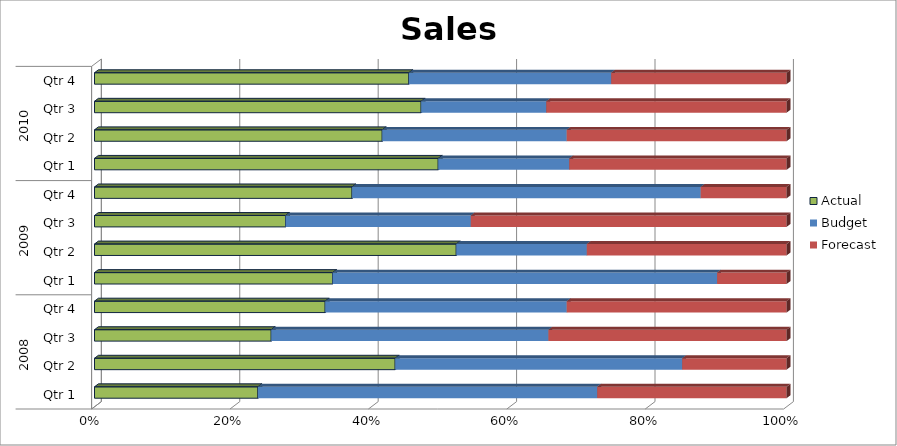
| Category | Actual | Budget | Forecast |
|---|---|---|---|
| 0 | 1450 | 3010 | 1680 |
| 1 | 2420 | 2310 | 840 |
| 2 | 1900 | 2980 | 2560 |
| 3 | 1490 | 1560 | 1420 |
| 4 | 1920 | 3100 | 560 |
| 5 | 2300 | 830 | 1270 |
| 6 | 1640 | 1590 | 2710 |
| 7 | 1980 | 2680 | 660 |
| 8 | 2230 | 850 | 1410 |
| 9 | 3010 | 1930 | 2300 |
| 10 | 2950 | 1130 | 2170 |
| 11 | 2330 | 1500 | 1300 |